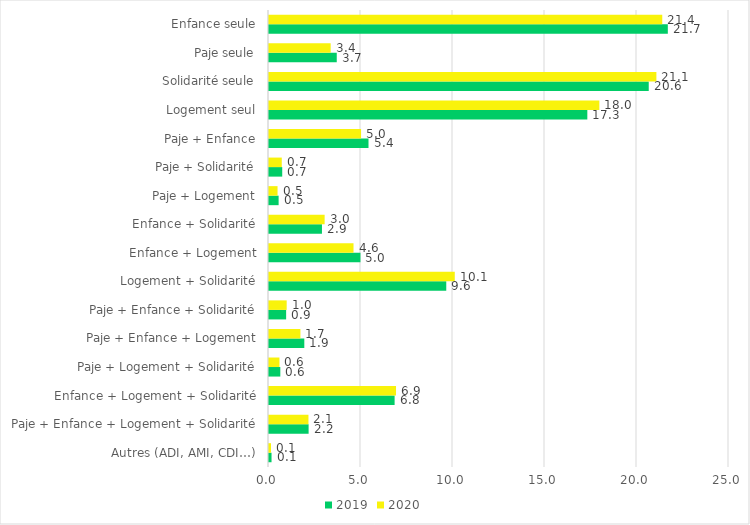
| Category | 2019 | 2020 |
|---|---|---|
| Autres (ADI, AMI, CDI…) | 0.137 | 0.109 |
| Paje + Enfance + Logement + Solidarité | 2.153 | 2.144 |
| Enfance + Logement + Solidarité | 6.827 | 6.903 |
| Paje + Logement + Solidarité | 0.616 | 0.568 |
| Paje + Enfance + Logement | 1.919 | 1.707 |
| Paje + Enfance + Solidarité | 0.931 | 0.961 |
| Logement + Solidarité | 9.634 | 10.097 |
| Enfance + Logement | 4.97 | 4.593 |
| Enfance + Solidarité | 2.878 | 3.024 |
| Paje + Logement | 0.523 | 0.465 |
| Paje + Solidarité | 0.719 | 0.694 |
| Paje + Enfance | 5.408 | 5.003 |
| Logement seul | 17.3 | 17.954 |
| Solidarité seule | 20.638 | 21.054 |
| Paje seule | 3.682 | 3.352 |
| Enfance seule | 21.675 | 21.373 |